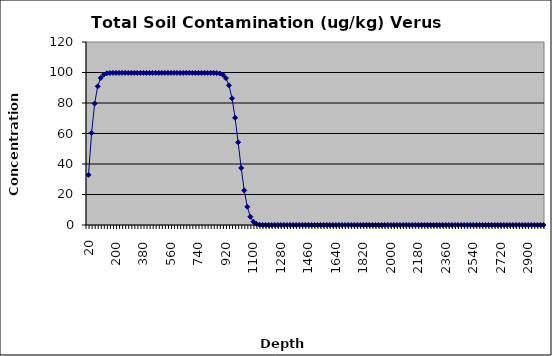
| Category | Series 0 |
|---|---|
| 20.0 | 32.884 |
| 40.0 | 60.393 |
| 60.0 | 79.643 |
| 80.0 | 90.911 |
| 100.0 | 96.427 |
| 120.0 | 98.686 |
| 140.0 | 99.46 |
| 160.0 | 99.682 |
| 180.0 | 99.735 |
| 200.0 | 99.745 |
| 220.0 | 99.747 |
| 240.0 | 99.747 |
| 260.0 | 99.747 |
| 280.0 | 99.747 |
| 300.0 | 99.747 |
| 320.0 | 99.747 |
| 340.0 | 99.747 |
| 360.0 | 99.747 |
| 380.0 | 99.747 |
| 400.0 | 99.747 |
| 420.0 | 99.747 |
| 440.0 | 99.747 |
| 460.0 | 99.747 |
| 480.0 | 99.747 |
| 500.0 | 99.747 |
| 520.0 | 99.747 |
| 540.0 | 99.747 |
| 560.0 | 99.747 |
| 580.0 | 99.747 |
| 600.0 | 99.747 |
| 620.0 | 99.747 |
| 640.0 | 99.747 |
| 660.0 | 99.747 |
| 680.0 | 99.747 |
| 700.0 | 99.747 |
| 720.0 | 99.747 |
| 740.0 | 99.747 |
| 760.0 | 99.747 |
| 780.0 | 99.747 |
| 800.0 | 99.747 |
| 820.0 | 99.744 |
| 840.0 | 99.727 |
| 860.0 | 99.653 |
| 880.0 | 99.379 |
| 900.0 | 98.529 |
| 920.0 | 96.334 |
| 940.0 | 91.599 |
| 960.0 | 83.077 |
| 980.0 | 70.27 |
| 1000.0 | 54.206 |
| 1020.0 | 37.386 |
| 1040.0 | 22.684 |
| 1060.0 | 11.957 |
| 1080.0 | 5.423 |
| 1100.0 | 2.102 |
| 1120.0 | 0.692 |
| 1140.0 | 0.193 |
| 1160.0 | 0.045 |
| 1180.0 | 0.009 |
| 1200.0 | 0.001 |
| 1220.0 | 0 |
| 1240.0 | 0 |
| 1260.0 | 0 |
| 1280.0 | 0 |
| 1300.0 | 0 |
| 1320.0 | 0 |
| 1340.0 | 0 |
| 1360.0 | 0 |
| 1380.0 | 0 |
| 1400.0 | 0 |
| 1420.0 | 0 |
| 1440.0 | 0 |
| 1460.0 | 0 |
| 1480.0 | 0 |
| 1500.0 | 0 |
| 1520.0 | 0 |
| 1540.0 | 0 |
| 1560.0 | 0 |
| 1580.0 | 0 |
| 1600.0 | 0 |
| 1620.0 | 0 |
| 1640.0 | 0 |
| 1660.0 | 0 |
| 1680.0 | 0 |
| 1700.0 | 0 |
| 1720.0 | 0 |
| 1740.0 | 0 |
| 1760.0 | 0 |
| 1780.0 | 0 |
| 1800.0 | 0 |
| 1820.0 | 0 |
| 1840.0 | 0 |
| 1860.0 | 0 |
| 1880.0 | 0 |
| 1900.0 | 0 |
| 1920.0 | 0 |
| 1940.0 | 0 |
| 1960.0 | 0 |
| 1980.0 | 0 |
| 2000.0 | 0 |
| 2020.0 | 0 |
| 2040.0 | 0 |
| 2060.0 | 0 |
| 2080.0 | 0 |
| 2100.0 | 0 |
| 2120.0 | 0 |
| 2140.0 | 0 |
| 2160.0 | 0 |
| 2180.0 | 0 |
| 2200.0 | 0 |
| 2220.0 | 0 |
| 2240.0 | 0 |
| 2260.0 | 0 |
| 2280.0 | 0 |
| 2300.0 | 0 |
| 2320.0 | 0 |
| 2340.0 | 0 |
| 2360.0 | 0 |
| 2380.0 | 0 |
| 2400.0 | 0 |
| 2420.0 | 0 |
| 2440.0 | 0 |
| 2460.0 | 0 |
| 2480.0 | 0 |
| 2500.0 | 0 |
| 2520.0 | 0 |
| 2540.0 | 0 |
| 2560.0 | 0 |
| 2580.0 | 0 |
| 2600.0 | 0 |
| 2620.0 | 0 |
| 2640.0 | 0 |
| 2660.0 | 0 |
| 2680.0 | 0 |
| 2700.0 | 0 |
| 2720.0 | 0 |
| 2740.0 | 0 |
| 2760.0 | 0 |
| 2780.0 | 0 |
| 2800.0 | 0 |
| 2820.0 | 0 |
| 2840.0 | 0 |
| 2860.0 | 0 |
| 2880.0 | 0 |
| 2900.0 | 0 |
| 2920.0 | 0 |
| 2940.0 | 0 |
| 2960.0 | 0 |
| 2980.0 | 0 |
| 3000.0 | 0 |